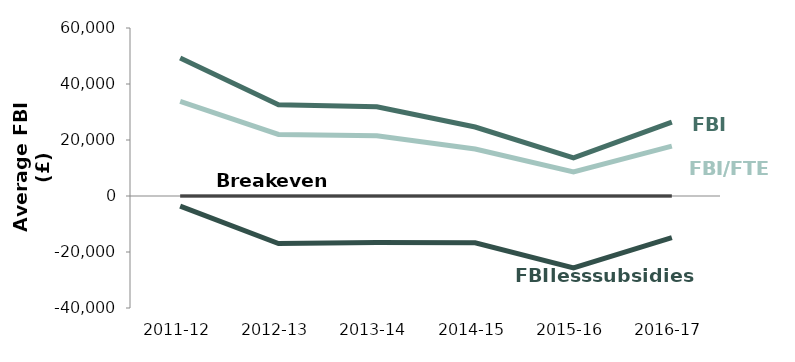
| Category | Farm Business Income (FBI) (£) | FBI per unpaid worker (FTE) (£) | FBI without subsidy and payments (£) | Break even |
|---|---|---|---|---|
| 2011-12 | 49300.567 | 33767.511 | -3599.346 | 0 |
| 2012-13 | 32554.296 | 21996.146 | -16968.983 | 0 |
| 2013-14 | 31876.011 | 21537.845 | -16566.508 | 0 |
| 2014-15 | 24632.731 | 16756.96 | -16694.992 | 0 |
| 2015-16 | 13633.252 | 8574.372 | -25704.169 | 0 |
| 2016-17 | 26402.3 | 17839.392 | -14904.9 | 0 |